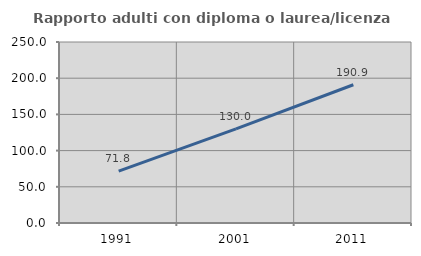
| Category | Rapporto adulti con diploma o laurea/licenza media  |
|---|---|
| 1991.0 | 71.753 |
| 2001.0 | 129.981 |
| 2011.0 | 190.916 |